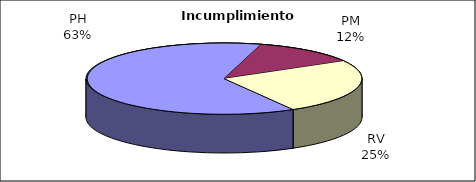
| Category | Valores |
|---|---|
| PH | 146 |
| PM | 29 |
| RV | 58 |